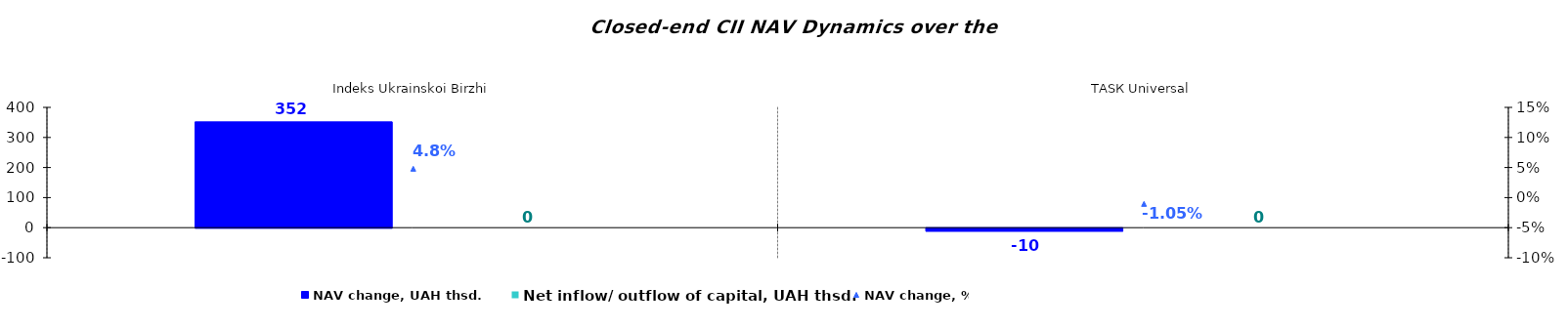
| Category | NAV change, UAH thsd. | Net inflow/ outflow of capital, UAH thsd. |
|---|---|---|
| Іndeks Ukrainskoi Birzhi | 351.75 | 0 |
| ТАSК Universal | -10.077 | 0 |